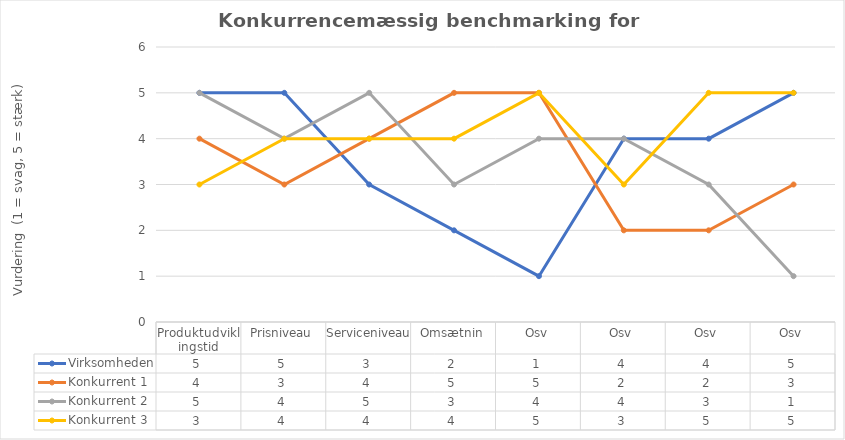
| Category | Virksomheden | Konkurrent 1 | Konkurrent 2 | Konkurrent 3 |
|---|---|---|---|---|
| Produktudviklingstid | 5 | 4 | 5 | 3 |
| Prisniveau | 5 | 3 | 4 | 4 |
| Serviceniveau | 3 | 4 | 5 | 4 |
| Omsætnin | 2 | 5 | 3 | 4 |
| Osv | 1 | 5 | 4 | 5 |
| Osv | 4 | 2 | 4 | 3 |
| Osv | 4 | 2 | 3 | 5 |
| Osv | 5 | 3 | 1 | 5 |